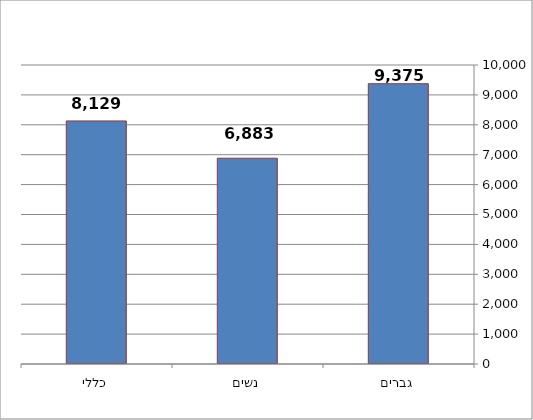
| Category | Series 0 |
|---|---|
| גברים | 9375 |
| נשים | 6883 |
| כללי | 8129 |